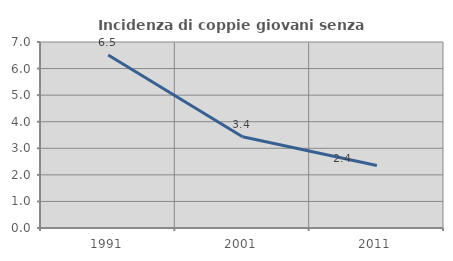
| Category | Incidenza di coppie giovani senza figli |
|---|---|
| 1991.0 | 6.512 |
| 2001.0 | 3.431 |
| 2011.0 | 2.353 |